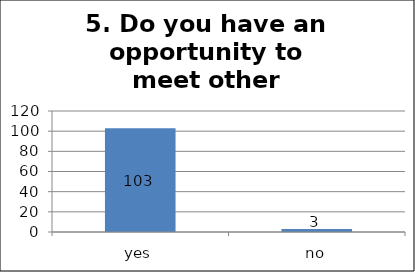
| Category | Series 0 |
|---|---|
| yes | 103 |
| no | 3 |